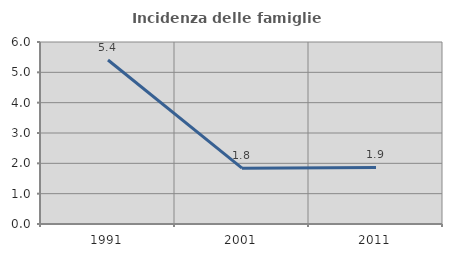
| Category | Incidenza delle famiglie numerose |
|---|---|
| 1991.0 | 5.405 |
| 2001.0 | 1.84 |
| 2011.0 | 1.863 |